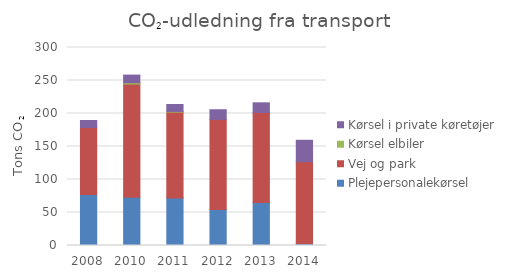
| Category | Plejepersonalekørsel | Vej og park | Kørsel elbiler | Kørsel i private køretøjer |
|---|---|---|---|---|
| 2008.0 | 77.2 | 101.6 | 0 | 10.6 |
| 2010.0 | 73 | 171.6 | 2 | 11.6 |
| 2011.0 | 72.1 | 130 | 1 | 10.5 |
| 2012.0 | 54.6 | 136.4 | 0 | 14.7 |
| 2013.0 | 65.1 | 136.4 | 0 | 14.7 |
| 2014.0 | 2.943 | 124.072 | 0 | 32.395 |